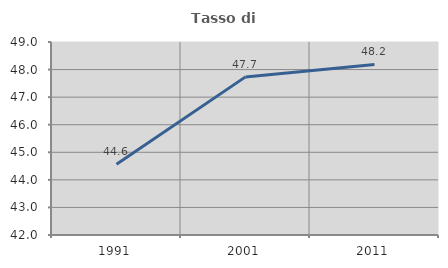
| Category | Tasso di occupazione   |
|---|---|
| 1991.0 | 44.563 |
| 2001.0 | 47.735 |
| 2011.0 | 48.185 |